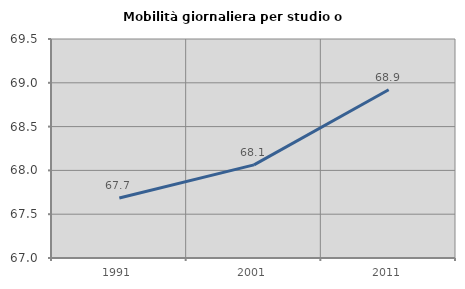
| Category | Mobilità giornaliera per studio o lavoro |
|---|---|
| 1991.0 | 67.685 |
| 2001.0 | 68.063 |
| 2011.0 | 68.92 |